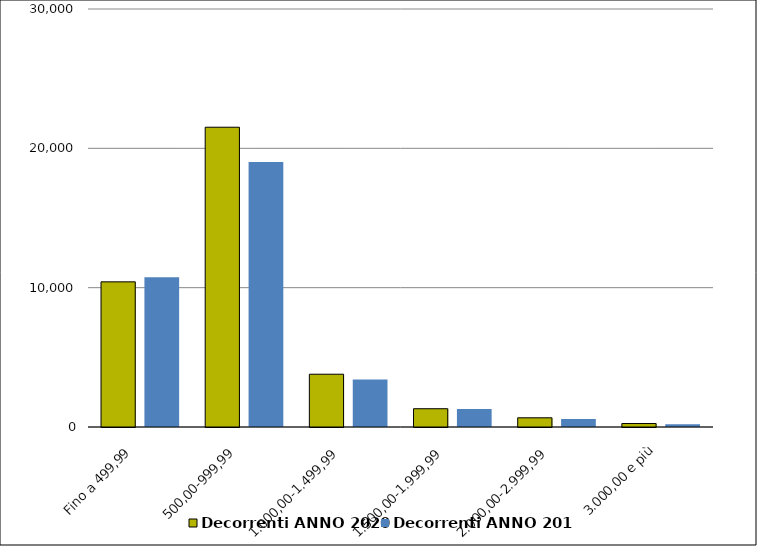
| Category | Decorrenti ANNO 2020 | Decorrenti ANNO 2019 |
|---|---|---|
| Fino a 499,99 | 10417 | 10743 |
| 500,00-999,99 | 21515 | 19020 |
| 1.000,00-1.499,99 | 3788 | 3409 |
| 1.500,00-1.999,99 | 1311 | 1298 |
| 2.000,00-2.999,99 | 660 | 575 |
| 3.000,00 e più | 248 | 199 |